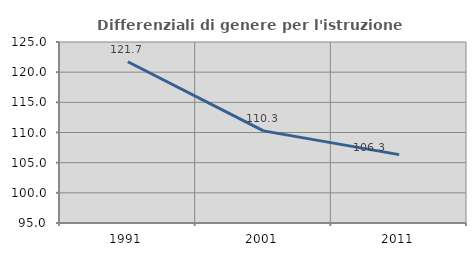
| Category | Differenziali di genere per l'istruzione superiore |
|---|---|
| 1991.0 | 121.721 |
| 2001.0 | 110.27 |
| 2011.0 | 106.334 |